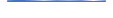
| Category | Series 0 |
|---|---|
| 0 | 8 |
| 1 | 11 |
| 2 | 8 |
| 3 | 3 |
| 4 | 8 |
| 5 | 5 |
| 6 | 8 |
| 7 | 1 |
| 8 | 7 |